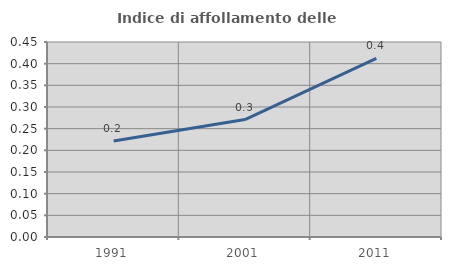
| Category | Indice di affollamento delle abitazioni  |
|---|---|
| 1991.0 | 0.221 |
| 2001.0 | 0.271 |
| 2011.0 | 0.412 |